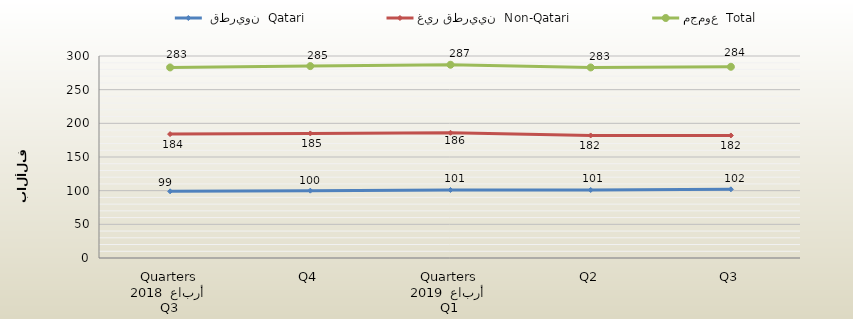
| Category |  قطريون  Qatari | غير قطريين  Non-Qatari | مجموع  Total |
|---|---|---|---|
| 0 | 99 | 184 | 283 |
| 1 | 100 | 185 | 285 |
| 2 | 101 | 186 | 287 |
| 3 | 101 | 182 | 283 |
| 4 | 102 | 182 | 284 |